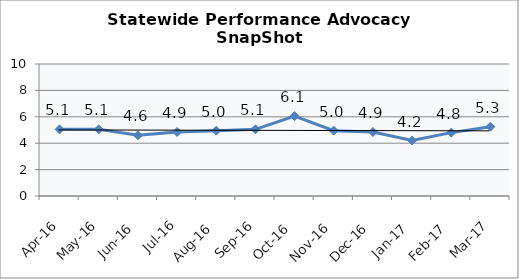
| Category | Statewide |
|---|---|
| Apr-16 | 5.05 |
| May-16 | 5.05 |
| Jun-16 | 4.6 |
| Jul-16 | 4.85 |
| Aug-16 | 4.95 |
| Sep-16 | 5.05 |
| Oct-16 | 6.05 |
| Nov-16 | 4.95 |
| Dec-16 | 4.85 |
| Jan-17 | 4.2 |
| Feb-17 | 4.8 |
| Mar-17 | 5.25 |